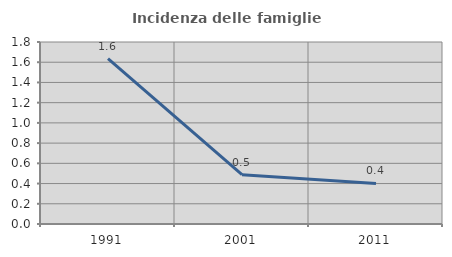
| Category | Incidenza delle famiglie numerose |
|---|---|
| 1991.0 | 1.635 |
| 2001.0 | 0.488 |
| 2011.0 | 0.401 |